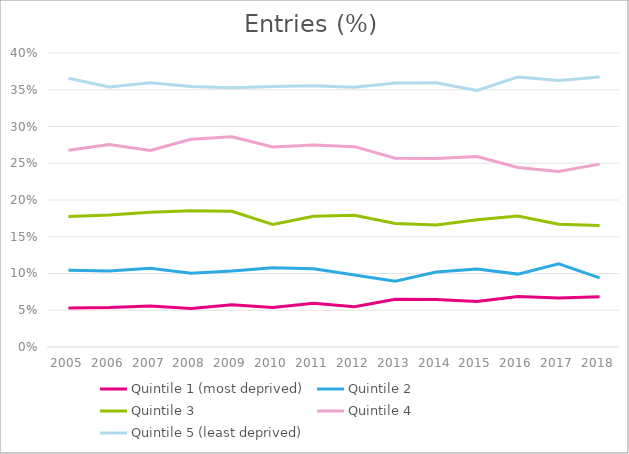
| Category | Quintile 1 (most deprived) | Quintile 2 | Quintile 3 | Quintile 4 | Quintile 5 (least deprived) |
|---|---|---|---|---|---|
| 2005.0 | 0.053 | 0.104 | 0.177 | 0.268 | 0.366 |
| 2006.0 | 0.054 | 0.103 | 0.18 | 0.275 | 0.354 |
| 2007.0 | 0.056 | 0.107 | 0.183 | 0.267 | 0.359 |
| 2008.0 | 0.052 | 0.1 | 0.185 | 0.283 | 0.355 |
| 2009.0 | 0.057 | 0.103 | 0.185 | 0.286 | 0.353 |
| 2010.0 | 0.054 | 0.108 | 0.167 | 0.272 | 0.354 |
| 2011.0 | 0.059 | 0.107 | 0.178 | 0.275 | 0.355 |
| 2012.0 | 0.055 | 0.098 | 0.179 | 0.273 | 0.353 |
| 2013.0 | 0.065 | 0.09 | 0.168 | 0.257 | 0.359 |
| 2014.0 | 0.064 | 0.102 | 0.166 | 0.256 | 0.359 |
| 2015.0 | 0.062 | 0.106 | 0.173 | 0.259 | 0.349 |
| 2016.0 | 0.069 | 0.099 | 0.178 | 0.244 | 0.367 |
| 2017.0 | 0.067 | 0.113 | 0.167 | 0.239 | 0.363 |
| 2018.0 | 0.068 | 0.094 | 0.165 | 0.249 | 0.367 |